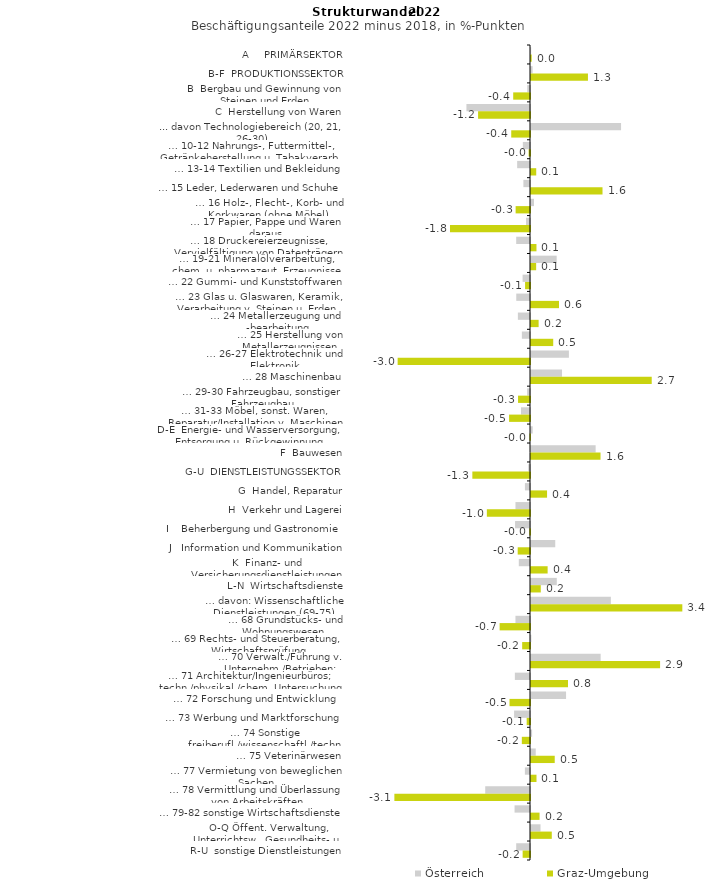
| Category | Österreich | Graz-Umgebung |
|---|---|---|
| A     PRIMÄRSEKTOR | 0.004 | 0.016 |
| B-F  PRODUKTIONSSEKTOR | 0.036 | 1.294 |
| B  Bergbau und Gewinnung von Steinen und Erden | -0.063 | -0.382 |
| C  Herstellung von Waren | -1.445 | -1.18 |
| ... davon Technologiebereich (20, 21, 26-30) | 2.047 | -0.427 |
| … 10-12 Nahrungs-, Futtermittel-, Getränkeherstellung u. Tabakverarb. | -0.163 | -0.031 |
| … 13-14 Textilien und Bekleidung | -0.292 | 0.119 |
| … 15 Leder, Lederwaren und Schuhe | -0.15 | 1.625 |
| … 16 Holz-, Flecht-, Korb- und Korkwaren (ohne Möbel)  | 0.068 | -0.327 |
| … 17 Papier, Pappe und Waren daraus  | -0.09 | -1.818 |
| … 18 Druckereierzeugnisse, Vervielfältigung von Datenträgern | -0.314 | 0.124 |
| … 19-21 Mineralölverarbeitung, chem. u. pharmazeut. Erzeugnisse | 0.584 | 0.117 |
| … 22 Gummi- und Kunststoffwaren | -0.168 | -0.112 |
| … 23 Glas u. Glaswaren, Keramik, Verarbeitung v. Steinen u. Erden  | -0.312 | 0.637 |
| … 24 Metallerzeugung und -bearbeitung | -0.276 | 0.173 |
| … 25 Herstellung von Metallerzeugnissen  | -0.185 | 0.505 |
| … 26-27 Elektrotechnik und Elektronik | 0.862 | -3.008 |
| … 28 Maschinenbau | 0.705 | 2.744 |
| … 29-30 Fahrzeugbau, sonstiger Fahrzeugbau | -0.066 | -0.272 |
| … 31-33 Möbel, sonst. Waren, Reparatur/Installation v. Maschinen | -0.204 | -0.475 |
| D-E  Energie- und Wasserversorgung, Entsorgung u. Rückgewinnung | 0.038 | -0.013 |
| F  Bauwesen | 1.469 | 1.58 |
| G-U  DIENSTLEISTUNGSSEKTOR | -0.04 | -1.31 |
| G  Handel, Reparatur | -0.115 | 0.365 |
| H  Verkehr und Lagerei | -0.33 | -0.981 |
| I    Beherbergung und Gastronomie | -0.34 | -0.016 |
| J   Information und Kommunikation | 0.551 | -0.28 |
| K  Finanz- und Versicherungsdienstleistungen | -0.255 | 0.378 |
| L-N  Wirtschaftsdienste | 0.586 | 0.222 |
| … davon: Wissenschaftliche Dienstleistungen (69-75) | 1.815 | 3.439 |
| … 68 Grundstücks- und Wohnungswesen  | -0.331 | -0.69 |
| … 69 Rechts- und Steuerberatung, Wirtschaftsprüfung | 0.008 | -0.178 |
| … 70 Verwalt./Führung v. Unternehm./Betrieben; Unternehmensberat. | 1.583 | 2.934 |
| … 71 Architektur/Ingenieurbüros; techn./physikal./chem. Untersuchung | -0.344 | 0.841 |
| … 72 Forschung und Entwicklung  | 0.797 | -0.466 |
| … 73 Werbung und Marktforschung | -0.361 | -0.075 |
| … 74 Sonstige freiberufl./wissenschaftl./techn. Tätigkeiten | 0.025 | -0.186 |
| … 75 Veterinärwesen | 0.108 | 0.539 |
| … 77 Vermietung von beweglichen Sachen  | -0.116 | 0.125 |
| … 78 Vermittlung und Überlassung von Arbeitskräften | -1.018 | -3.082 |
| … 79-82 sonstige Wirtschaftsdienste | -0.351 | 0.194 |
| O-Q Öffent. Verwaltung, Unterrichtsw., Gesundheits- u. Sozialwesen | 0.216 | 0.472 |
| R-U  sonstige Dienstleistungen | -0.314 | -0.167 |